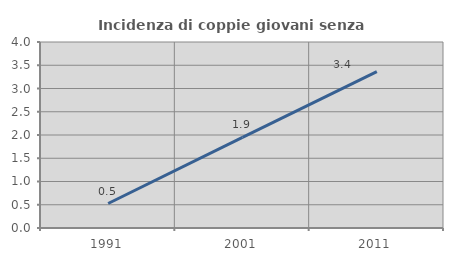
| Category | Incidenza di coppie giovani senza figli |
|---|---|
| 1991.0 | 0.526 |
| 2001.0 | 1.948 |
| 2011.0 | 3.361 |